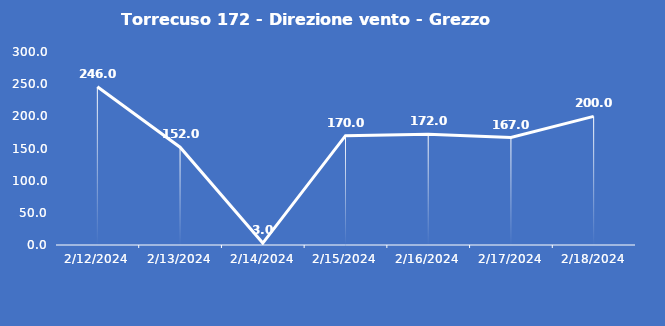
| Category | Torrecuso 172 - Direzione vento - Grezzo (°N) |
|---|---|
| 2/12/24 | 246 |
| 2/13/24 | 152 |
| 2/14/24 | 3 |
| 2/15/24 | 170 |
| 2/16/24 | 172 |
| 2/17/24 | 167 |
| 2/18/24 | 200 |